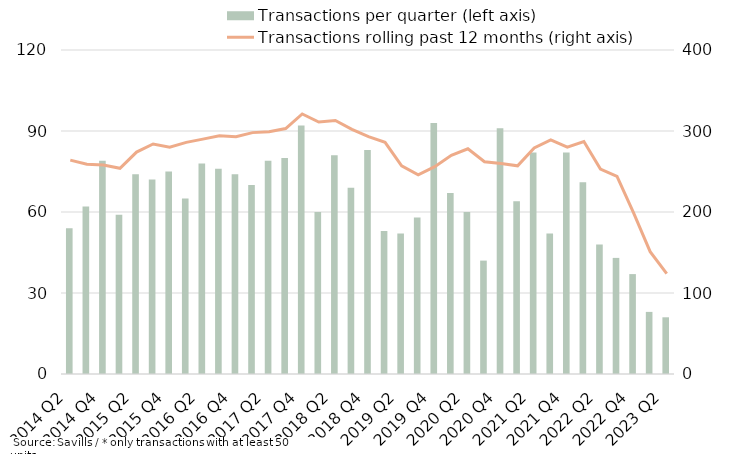
| Category | Transactions per quarter (left axis) |
|---|---|
| 2014 Q2 | 54 |
| 2014 Q3 | 62 |
| 2014 Q4 | 79 |
| 2015 Q1 | 59 |
| 2015 Q2 | 74 |
| 2015 Q3 | 72 |
| 2015 Q4 | 75 |
| 2016 Q1 | 65 |
| 2016 Q2 | 78 |
| 2016 Q3 | 76 |
| 2016 Q4 | 74 |
| 2017 Q1 | 70 |
| 2017 Q2 | 79 |
| 2017 Q3 | 80 |
| 2017 Q4 | 92 |
| 2018 Q1 | 60 |
| 2018 Q2 | 81 |
| 2018 Q3 | 69 |
| 2018 Q4 | 83 |
| 2019 Q1 | 53 |
| 2019 Q2 | 52 |
| 2019 Q3 | 58 |
| 2019 Q4 | 93 |
| 2020 Q1 | 67 |
| 2020 Q2 | 60 |
| 2020 Q3 | 42 |
| 2020 Q4 | 91 |
| 2021 Q1 | 64 |
| 2021 Q2 | 82 |
| 2021 Q3 | 52 |
| 2021 Q4 | 82 |
| 2022 Q1 | 71 |
| 2022 Q2 | 48 |
| 2022 Q3 | 43 |
| 2022 Q4 | 37 |
| 2023 Q1 | 23 |
| 2023 Q2 | 21 |